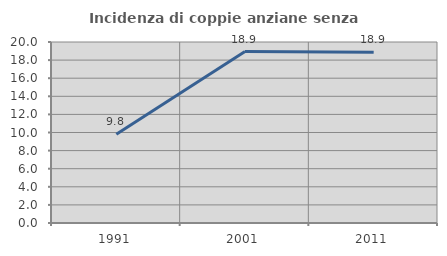
| Category | Incidenza di coppie anziane senza figli  |
|---|---|
| 1991.0 | 9.815 |
| 2001.0 | 18.946 |
| 2011.0 | 18.855 |